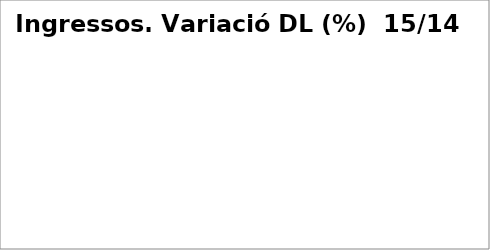
| Category | Series 0 |
|---|---|
| Impostos directes | 0.074 |
| Impostos indirectes | 0.035 |
| Taxes, preus públics i altres ingressos | 0.002 |
| Transferències corrents | 0.079 |
| Ingressos patrimonials | 0.359 |
| Venda d'inversions reals | -0.724 |
| Transferències de capital | 1.281 |
| Actius financers* | 0 |
| Passius financers | -0.006 |